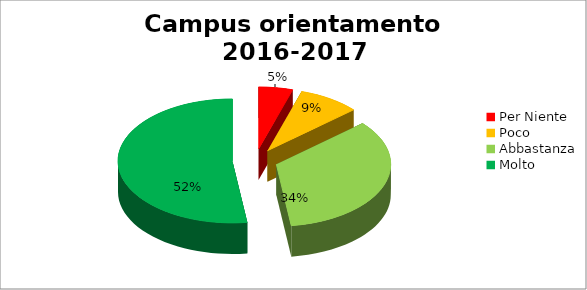
| Category | Series 0 |
|---|---|
| Per Niente | 0.048 |
| Poco | 0.087 |
| Abbastanza | 0.344 |
| Molto | 0.521 |